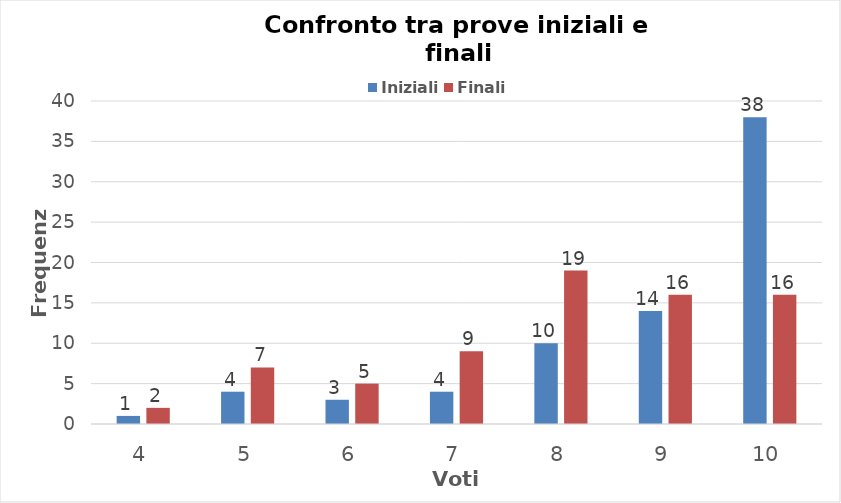
| Category | Iniziali | Finali |
|---|---|---|
| 4.0 | 1 | 2 |
| 5.0 | 4 | 7 |
| 6.0 | 3 | 5 |
| 7.0 | 4 | 9 |
| 8.0 | 10 | 19 |
| 9.0 | 14 | 16 |
| 10.0 | 38 | 16 |